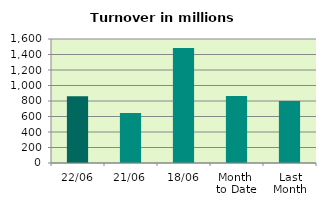
| Category | Series 0 |
|---|---|
| 22/06 | 861.054 |
| 21/06 | 643.557 |
| 18/06 | 1482.642 |
| Month 
to Date | 863.744 |
| Last
Month | 798.504 |